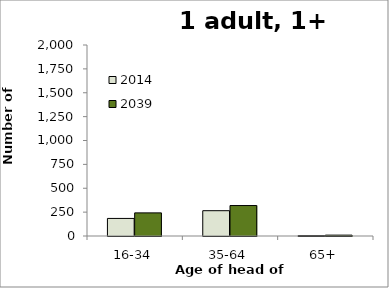
| Category | 2014 | 2039 |
|---|---|---|
| 16-34 | 184 | 242 |
| 35-64 | 265 | 319 |
| 65+ | 4 | 9 |